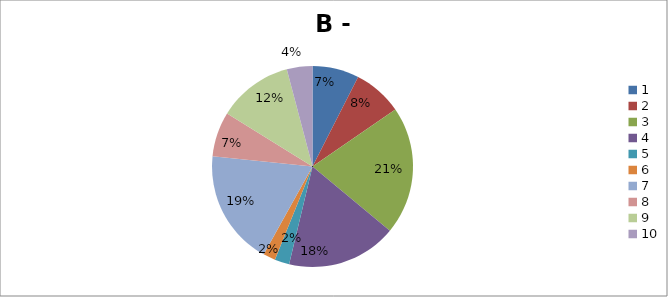
| Category | Series 0 |
|---|---|
| 0 | 364 |
| 1 | 384 |
| 2 | 1000 |
| 3 | 860 |
| 4 | 115 |
| 5 | 95 |
| 6 | 900 |
| 7 | 350 |
| 8 | 585 |
| 9 | 200 |